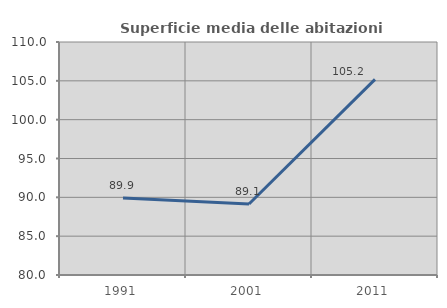
| Category | Superficie media delle abitazioni occupate |
|---|---|
| 1991.0 | 89.928 |
| 2001.0 | 89.141 |
| 2011.0 | 105.181 |